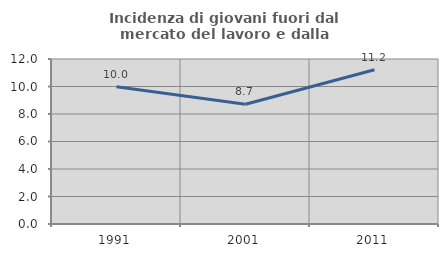
| Category | Incidenza di giovani fuori dal mercato del lavoro e dalla formazione  |
|---|---|
| 1991.0 | 9.984 |
| 2001.0 | 8.713 |
| 2011.0 | 11.213 |